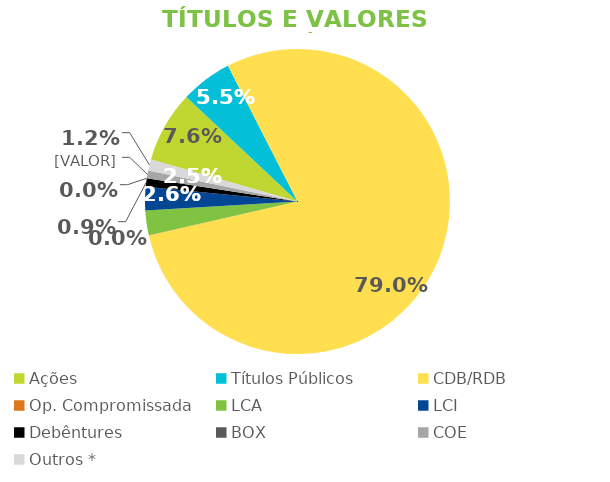
| Category | TVM |
|---|---|
| Ações | 0.076 |
| Títulos Públicos | 0.055 |
| CDB/RDB | 0.79 |
| Op. Compromissada | 0 |
| LCA | 0.026 |
| LCI | 0.025 |
| Debêntures | 0.009 |
| BOX | 0 |
| COE | 0.008 |
| Outros * | 0.012 |